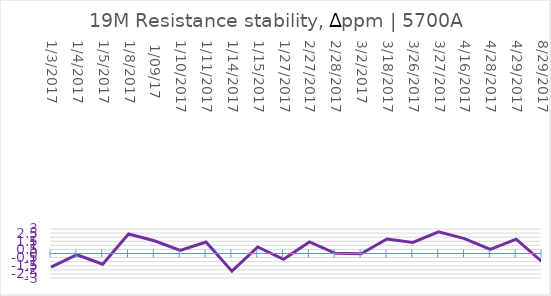
| Category | Series 0 |
|---|---|
| 1/3/2017 | -1.68 |
| 1/4/2017 | -0.15 |
| 1/5/2017 | -1.32 |
| 1/8/2017 | 2.39 |
|  1/09/17 | 1.56 |
| 1/10/2017 | 0.37 |
| 1/11/2017 | 1.41 |
| 1/14/2017 | -2.16 |
| 1/15/2017 | 0.8 |
| 1/27/2017 | -0.71 |
| 2/27/2017 | 1.41 |
| 2/28/2017 | 0.03 |
| 3/2/2017 | -0.03 |
| 3/18/2017 | 1.77 |
| 3/26/2017 | 1.36 |
| 3/27/2017 | 2.65 |
| 4/16/2017 | 1.83 |
| 4/28/2017 | 0.49 |
| 4/29/2017 | 1.75 |
| 8/29/2017 | -1.01 |